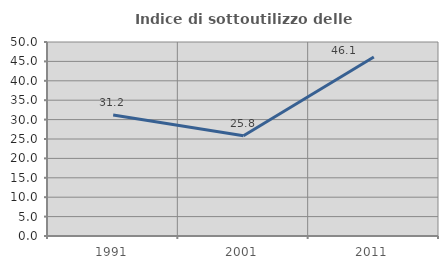
| Category | Indice di sottoutilizzo delle abitazioni  |
|---|---|
| 1991.0 | 31.159 |
| 2001.0 | 25.82 |
| 2011.0 | 46.119 |